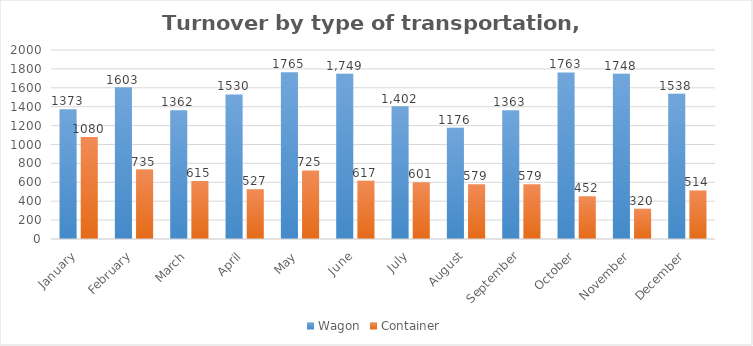
| Category | Wagon | Container |
|---|---|---|
| January | 1373 | 1080 |
| February | 1603 | 735 |
| March | 1362 | 615 |
| April | 1530 | 527 |
| May | 1765 | 725 |
| June | 1749 | 617 |
| July | 1402 | 601 |
| August | 1176 | 579 |
| September | 1363 | 579 |
| October | 1763 | 452 |
| November | 1748 | 320 |
| December | 1538 | 514 |